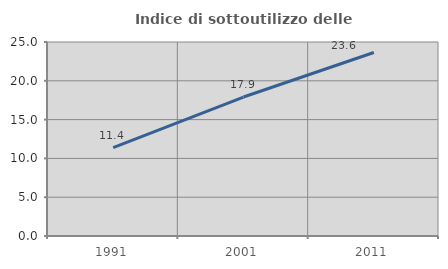
| Category | Indice di sottoutilizzo delle abitazioni  |
|---|---|
| 1991.0 | 11.384 |
| 2001.0 | 17.908 |
| 2011.0 | 23.649 |